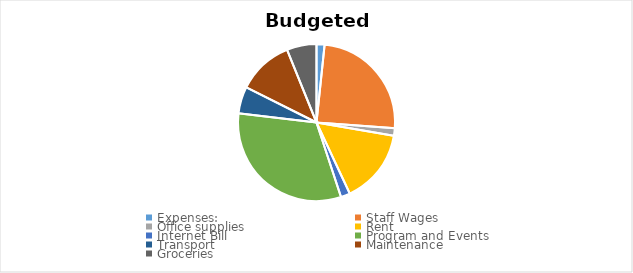
| Category | Series 0 | Series 1 |
|---|---|---|
| Expenses: | 2020 | 2021 |
| Staff Wages  | 29914.308 | 29914.308 |
| Office supplies  | 1869.644 | 1869.644 |
| Rent  | 18696.442 | 18696.442 |
| Internet Bill | 2337.055 | 2337.055 |
| Program and Events  | 38950.922 | 38950.922 |
| Transport  | 6730.719 | 6730.719 |
| Maintenance  | 14022.332 | 14022.332 |
| Groceries | 7478.577 | 7478.577 |